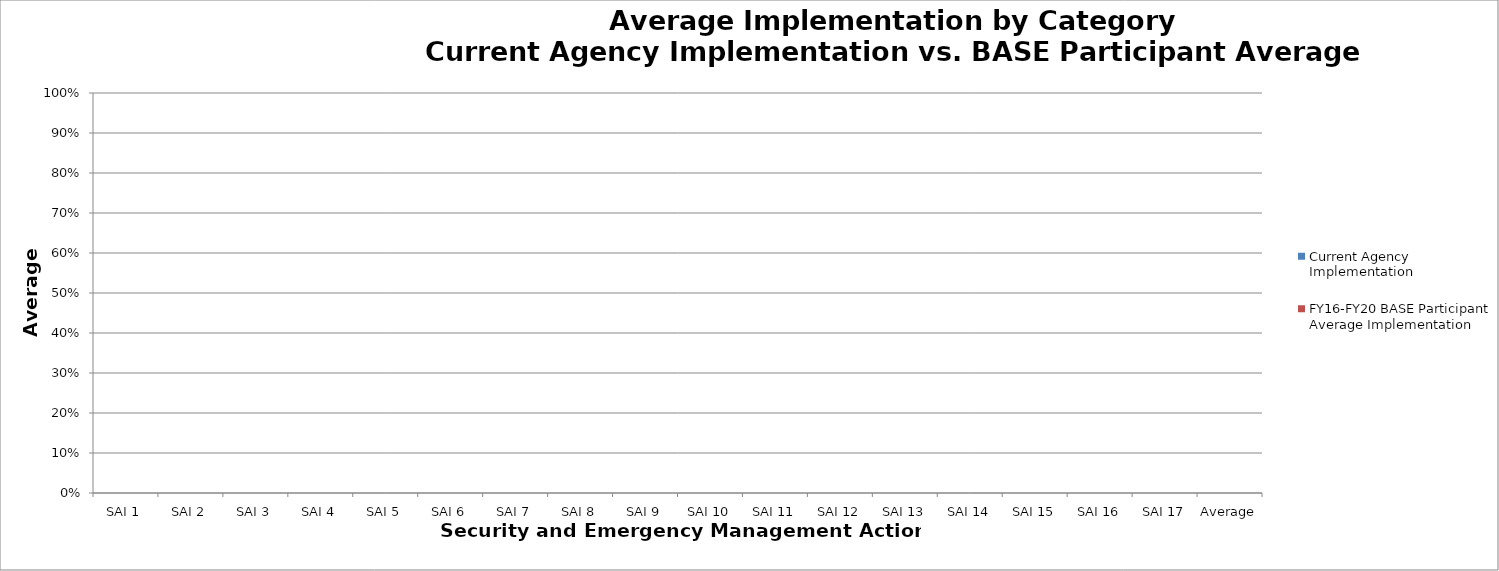
| Category | Current Agency Implementation | FY16-FY20 BASE Participant Average Implementation |
|---|---|---|
| SAI 1 | 0 | 0 |
| SAI 2 | 0 | 0 |
| SAI 3 | 0 | 0 |
| SAI 4 | 0 | 0 |
| SAI 5 | 0 | 0 |
| SAI 6 | 0 | 0 |
| SAI 7 | 0 | 0 |
| SAI 8 | 0 | 0 |
| SAI 9 | 0 | 0 |
| SAI 10 | 0 | 0 |
| SAI 11 | 0 | 0 |
| SAI 12 | 0 | 0 |
| SAI 13 | 0 | 0 |
| SAI 14 | 0 | 0 |
| SAI 15 | 0 | 0 |
| SAI 16 | 0 | 0 |
| SAI 17 | 0 | 0 |
| Average | 0 | 0 |